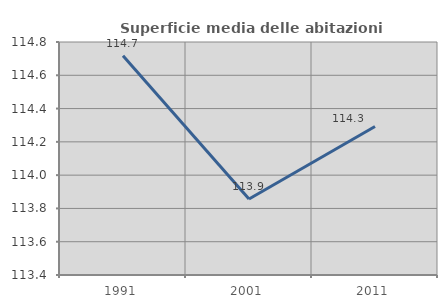
| Category | Superficie media delle abitazioni occupate |
|---|---|
| 1991.0 | 114.718 |
| 2001.0 | 113.857 |
| 2011.0 | 114.293 |